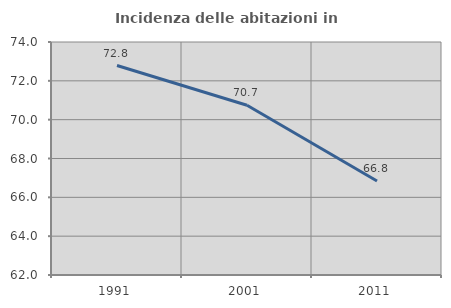
| Category | Incidenza delle abitazioni in proprietà  |
|---|---|
| 1991.0 | 72.789 |
| 2001.0 | 70.742 |
| 2011.0 | 66.839 |